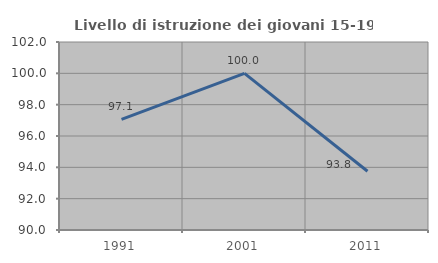
| Category | Livello di istruzione dei giovani 15-19 anni |
|---|---|
| 1991.0 | 97.059 |
| 2001.0 | 100 |
| 2011.0 | 93.75 |